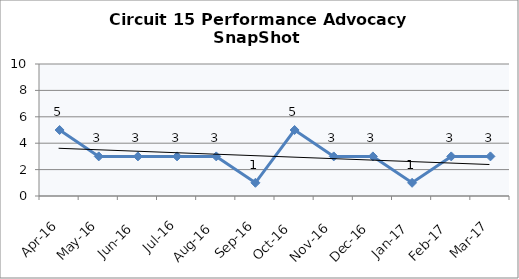
| Category | Circuit 15 |
|---|---|
| Apr-16 | 5 |
| May-16 | 3 |
| Jun-16 | 3 |
| Jul-16 | 3 |
| Aug-16 | 3 |
| Sep-16 | 1 |
| Oct-16 | 5 |
| Nov-16 | 3 |
| Dec-16 | 3 |
| Jan-17 | 1 |
| Feb-17 | 3 |
| Mar-17 | 3 |